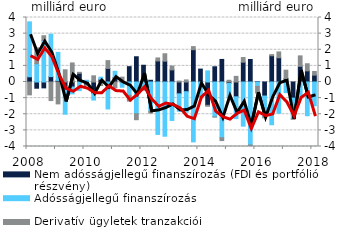
| Category | Nem adósságjellegű finanszírozás (FDI és portfólió részvény) | Adósságjellegű finanszírozás | Derivatív ügyletek tranzakciói |
|---|---|---|---|
| 2008.0 | 0.322 | 3.407 | -0.797 |
| 2008.0 | -0.385 | 1.131 | 0.986 |
| 2008.0 | -0.364 | 2.578 | 0.292 |
| 2008.0 | 0.334 | 2.628 | -1.152 |
| 2009.0 | 0.096 | 1.742 | -1.358 |
| 2009.0 | -0.495 | -1.502 | 0.758 |
| 2009.0 | -0.31 | -0.426 | 1.181 |
| 2009.0 | 0.54 | -0.537 | 0.06 |
| 2010.0 | -0.188 | 0.108 | -0.028 |
| 2010.0 | -0.709 | -0.411 | 0.384 |
| 2010.0 | 0.167 | 0.134 | -0.216 |
| 2010.0 | 0.841 | -1.672 | 0.485 |
| 2011.0 | 0.279 | 0.384 | -0.362 |
| 2011.0 | -0.045 | -0.279 | 0.301 |
| 2011.0 | 0.951 | -0.827 | -0.355 |
| 2011.0 | 1.566 | -1.967 | -0.372 |
| 2012.0 | 1.038 | -0.282 | -0.228 |
| 2012.0 | 0.107 | -1.816 | -0.112 |
| 2012.0 | 1.307 | -3.251 | 0.185 |
| 2012.0 | 1.29 | -3.363 | 0.461 |
| 2013.0 | 0.752 | -2.385 | 0.238 |
| 2013.0 | -0.734 | -1.079 | 0.057 |
| 2013.0 | -0.601 | -1.268 | 0.129 |
| 2013.0 | 2.002 | -3.715 | 0.193 |
| 2014.0 | 0.8 | -0.873 | -0.015 |
| 2014.0 | -1.445 | 0.687 | -0.062 |
| 2014.0 | 0.944 | -2.164 | -0.012 |
| 2014.0 | 1.399 | -3.458 | -0.175 |
| 2015.0 | -0.094 | -0.877 | 0.108 |
| 2015.0 | -0.918 | -1.353 | 0.349 |
| 2015.0 | 1.228 | -2.738 | 0.289 |
| 2015.0 | 1.396 | -3.908 | -0.059 |
| 2016.0 | 0.018 | -0.276 | -0.406 |
| 2016.0 | -0.87 | -1.275 | -0.078 |
| 2016.0 | 1.629 | -2.651 | 0.07 |
| 2016.0 | 1.504 | -1.939 | 0.361 |
| 2017.0 | 0.218 | -0.661 | 0.515 |
| 2017.0 | -1 | -1.287 | -0.027 |
| 2017.0 | 0.971 | -0.914 | 0.649 |
| 2017.0 | 0.691 | -2.093 | 0.44 |
| 2018.0 | 0.426 | -1.475 | 0.224 |